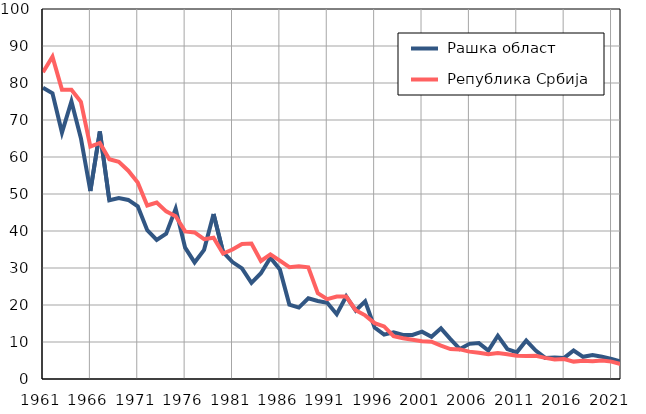
| Category |  Рашка област |  Република Србија |
|---|---|---|
| 1961.0 | 78.7 | 82.9 |
| 1962.0 | 77.2 | 87.1 |
| 1963.0 | 66.6 | 78.2 |
| 1964.0 | 75 | 78.2 |
| 1965.0 | 65.1 | 74.9 |
| 1966.0 | 50.8 | 62.8 |
| 1967.0 | 66.9 | 63.8 |
| 1968.0 | 48.3 | 59.4 |
| 1969.0 | 48.9 | 58.7 |
| 1970.0 | 48.4 | 56.3 |
| 1971.0 | 46.7 | 53.1 |
| 1972.0 | 40.2 | 46.9 |
| 1973.0 | 37.6 | 47.7 |
| 1974.0 | 39.3 | 45.3 |
| 1975.0 | 46 | 44 |
| 1976.0 | 35.5 | 39.9 |
| 1977.0 | 31.5 | 39.6 |
| 1978.0 | 34.9 | 37.8 |
| 1979.0 | 44.6 | 38.2 |
| 1980.0 | 34.3 | 33.9 |
| 1981.0 | 31.6 | 35 |
| 1982.0 | 29.9 | 36.5 |
| 1983.0 | 26 | 36.6 |
| 1984.0 | 28.6 | 31.9 |
| 1985.0 | 32.8 | 33.7 |
| 1986.0 | 29.6 | 32 |
| 1987.0 | 20.1 | 30.2 |
| 1988.0 | 19.3 | 30.5 |
| 1989.0 | 21.8 | 30.2 |
| 1990.0 | 21.1 | 23.2 |
| 1991.0 | 20.6 | 21.6 |
| 1992.0 | 17.5 | 22.3 |
| 1993.0 | 22.3 | 22.3 |
| 1994.0 | 18.5 | 18.6 |
| 1995.0 | 21 | 17.2 |
| 1996.0 | 13.9 | 15.1 |
| 1997.0 | 12 | 14.2 |
| 1998.0 | 12.6 | 11.6 |
| 1999.0 | 11.9 | 11 |
| 2000.0 | 11.9 | 10.6 |
| 2001.0 | 12.8 | 10.2 |
| 2002.0 | 11.4 | 10.1 |
| 2003.0 | 13.7 | 9 |
| 2004.0 | 10.8 | 8.1 |
| 2005.0 | 8.1 | 8 |
| 2006.0 | 9.5 | 7.4 |
| 2007.0 | 9.7 | 7.1 |
| 2008.0 | 7.7 | 6.7 |
| 2009.0 | 11.7 | 7 |
| 2010.0 | 8.1 | 6.7 |
| 2011.0 | 7.2 | 6.3 |
| 2012.0 | 10.4 | 6.2 |
| 2013.0 | 7.7 | 6.3 |
| 2014.0 | 5.7 | 5.7 |
| 2015.0 | 5.8 | 5.3 |
| 2016.0 | 5.7 | 5.4 |
| 2017.0 | 7.7 | 4.7 |
| 2018.0 | 6 | 4.9 |
| 2019.0 | 6.5 | 4.8 |
| 2020.0 | 6 | 5 |
| 2021.0 | 5.4 | 4.7 |
| 2022.0 | 4.7 | 4 |